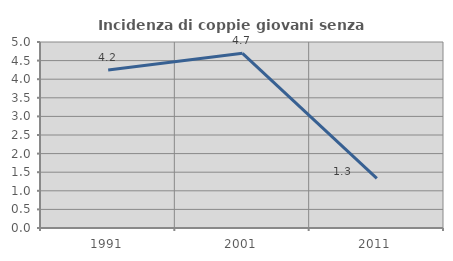
| Category | Incidenza di coppie giovani senza figli |
|---|---|
| 1991.0 | 4.249 |
| 2001.0 | 4.696 |
| 2011.0 | 1.333 |